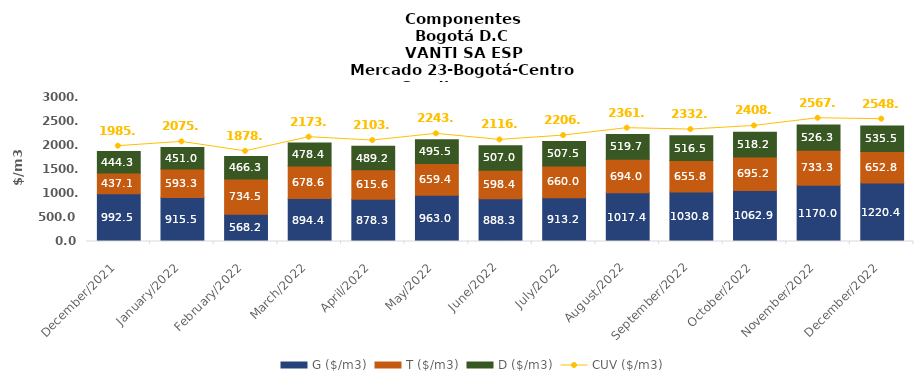
| Category | G ($/m3) | T ($/m3) | D ($/m3) |
|---|---|---|---|
| 2021-12-01 | 992.5 | 437.11 | 444.32 |
| 2022-01-01 | 915.46 | 593.32 | 451.03 |
| 2022-02-01 | 568.19 | 734.47 | 466.27 |
| 2022-03-01 | 894.37 | 678.63 | 478.39 |
| 2022-04-01 | 878.25 | 615.62 | 489.18 |
| 2022-05-01 | 963.04 | 659.37 | 495.47 |
| 2022-06-01 | 888.33 | 598.42 | 506.96 |
| 2022-07-01 | 913.23 | 660.02 | 507.54 |
| 2022-08-01 | 1017.43 | 694.03 | 519.71 |
| 2022-09-01 | 1030.83 | 655.81 | 516.52 |
| 2022-10-01 | 1062.85 | 695.15 | 518.18 |
| 2022-11-01 | 1169.95 | 733.29 | 526.27 |
| 2022-12-01 | 1220.44 | 652.77 | 535.5 |